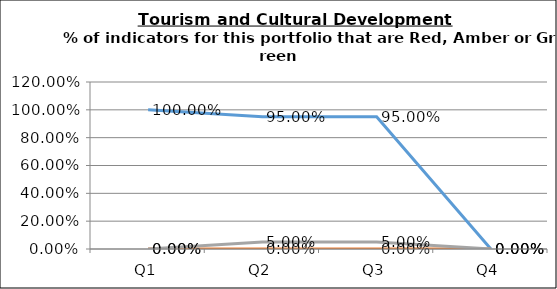
| Category | Green | Amber | Red |
|---|---|---|---|
| Q1 | 1 | 0 | 0 |
| Q2 | 0.95 | 0 | 0.05 |
| Q3 | 0.95 | 0 | 0.05 |
| Q4 | 0 | 0 | 0 |